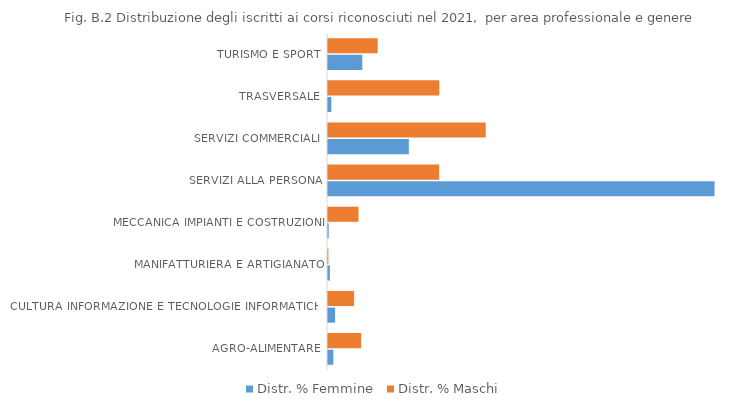
| Category | Distr. % Femmine | Distr. % Maschi |
|---|---|---|
| AGRO-ALIMENTARE | 1.028 | 6.384 |
| CULTURA INFORMAZIONE E TECNOLOGIE INFORMATICHE | 1.362 | 5.018 |
| MANIFATTURIERA E ARTIGIANATO | 0.36 | 0.074 |
| MECCANICA IMPIANTI E COSTRUZIONI | 0.128 | 5.867 |
| SERVIZI ALLA PERSONA | 74.332 | 21.365 |
| SERVIZI COMMERCIALI | 15.545 | 30.332 |
| TRASVERSALE | 0.642 | 21.402 |
| TURISMO E SPORT | 6.603 | 9.557 |